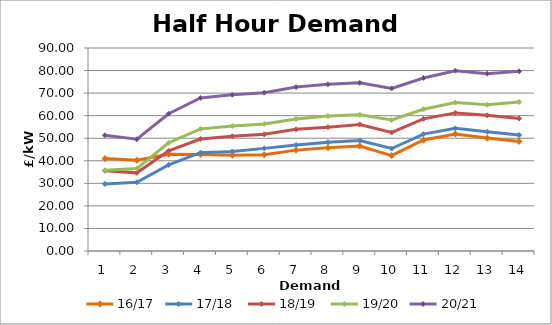
| Category | 16/17 | 17/18  | 18/19  | 19/20 | 20/21  |
|---|---|---|---|---|---|
| 1.0 | 40.966 | 29.732 | 35.59 | 35.844 | 51.319 |
| 2.0 | 40.244 | 30.446 | 34.644 | 36.548 | 49.532 |
| 3.0 | 42.928 | 38.161 | 44.384 | 47.976 | 60.856 |
| 4.0 | 42.828 | 43.593 | 49.657 | 54.115 | 67.866 |
| 5.0 | 42.494 | 44.126 | 50.879 | 55.421 | 69.282 |
| 6.0 | 42.678 | 45.498 | 51.733 | 56.329 | 70.205 |
| 7.0 | 44.725 | 47.007 | 53.941 | 58.54 | 72.659 |
| 8.0 | 45.739 | 48.259 | 54.897 | 59.808 | 73.899 |
| 9.0 | 46.543 | 49.023 | 56.091 | 60.417 | 74.539 |
| 10.0 | 42.307 | 45.437 | 52.548 | 58.065 | 72.105 |
| 11.0 | 49.204 | 51.83 | 58.58 | 62.853 | 76.703 |
| 12.0 | 51.87 | 54.371 | 61.229 | 65.781 | 79.939 |
| 13.0 | 50.078 | 52.832 | 60.145 | 64.84 | 78.613 |
| 14.0 | 48.58 | 51.429 | 58.774 | 66.049 | 79.663 |